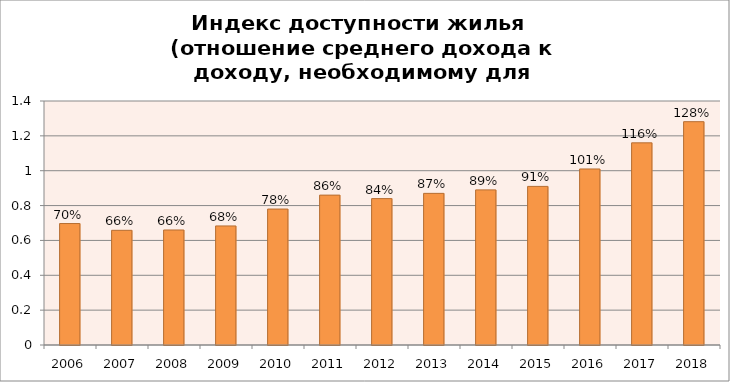
| Category | Series 0 |
|---|---|
| 2006.0 | 0.697 |
| 2007.0 | 0.658 |
| 2008.0 | 0.66 |
| 2009.0 | 0.683 |
| 2010.0 | 0.78 |
| 2011.0 | 0.86 |
| 2012.0 | 0.84 |
| 2013.0 | 0.87 |
| 2014.0 | 0.89 |
| 2015.0 | 0.91 |
| 2016.0 | 1.01 |
| 2017.0 | 1.16 |
| 2018.0 | 1.281 |